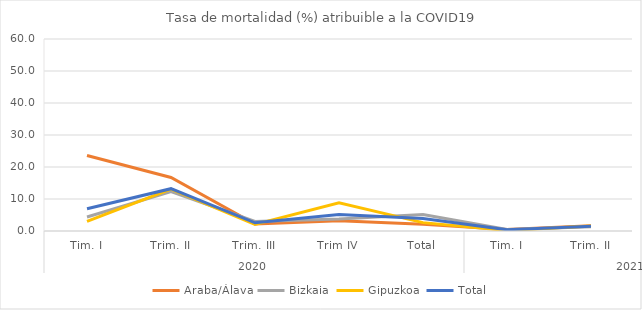
| Category | Araba/Álava | Bizkaia | Gipuzkoa | Total |
|---|---|---|---|---|
| 0 | 23.577 | 4.374 | 3.022 | 6.979 |
| 1 | 16.724 | 12.298 | 13.072 | 13.228 |
| 2 | 2.195 | 2.987 | 2.02 | 2.57 |
| 3 | 3.199 | 3.721 | 8.806 | 5.144 |
| 4 | 2.076 | 5.165 | 2.614 | 3.914 |
| 5 | 0.474 | 0.472 | 0.175 | 0.385 |
| 6 | 1.67 | 1.336 | 1.586 | 1.463 |